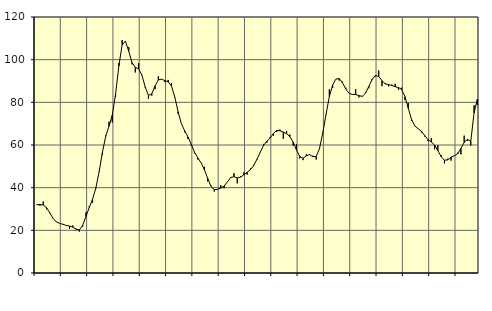
| Category | Piggar | Series 1 |
|---|---|---|
| nan | 31.9 | 32 |
| 87.0 | 31.5 | 32.09 |
| 87.0 | 33.5 | 31.84 |
| 87.0 | 29.9 | 30.66 |
| nan | 28.4 | 28.16 |
| 88.0 | 25.5 | 25.61 |
| 88.0 | 24 | 23.91 |
| 88.0 | 23.2 | 23.28 |
| nan | 23 | 22.83 |
| 89.0 | 22.2 | 22.31 |
| 89.0 | 20.7 | 22 |
| 89.0 | 22.3 | 21.5 |
| nan | 20.8 | 20.48 |
| 90.0 | 19.4 | 20.21 |
| 90.0 | 21.7 | 22.38 |
| 90.0 | 28.4 | 26.5 |
| nan | 31.3 | 30.73 |
| 91.0 | 32.8 | 34.6 |
| 91.0 | 39.6 | 39.81 |
| 91.0 | 47.7 | 47.47 |
| nan | 55.5 | 56.57 |
| 92.0 | 64.4 | 64.08 |
| 92.0 | 70.9 | 68.8 |
| 92.0 | 70.6 | 73.96 |
| nan | 82.6 | 83.82 |
| 93.0 | 98.4 | 97.02 |
| 93.0 | 109.2 | 106.95 |
| 93.0 | 108.5 | 108.73 |
| nan | 105.9 | 103.95 |
| 94.0 | 97.8 | 98.62 |
| 94.0 | 94 | 96.4 |
| 94.0 | 98.4 | 95.74 |
| nan | 92.9 | 92.78 |
| 95.0 | 86.9 | 87.21 |
| 95.0 | 81.6 | 83.26 |
| 95.0 | 83.1 | 83.99 |
| nan | 86.2 | 87.69 |
| 96.0 | 92.2 | 90.52 |
| 96.0 | 90.9 | 90.85 |
| 96.0 | 89.5 | 90.18 |
| nan | 90.5 | 89.58 |
| 97.0 | 89 | 87.57 |
| 97.0 | 82.4 | 82.52 |
| 97.0 | 74.6 | 75.61 |
| nan | 70 | 70.04 |
| 98.0 | 66 | 66.68 |
| 98.0 | 62.8 | 63.81 |
| 98.0 | 59.6 | 60.38 |
| nan | 56.1 | 56.63 |
| 99.0 | 53.2 | 53.98 |
| 99.0 | 51.7 | 51.64 |
| 99.0 | 49.8 | 48.45 |
| nan | 42.9 | 44.41 |
| 0.0 | 41 | 40.71 |
| 0.0 | 38.2 | 39.05 |
| 0.0 | 39.4 | 39.2 |
| nan | 41.1 | 39.79 |
| 1.0 | 39.7 | 40.76 |
| 1.0 | 42.7 | 42.72 |
| 1.0 | 45 | 44.76 |
| nan | 46.8 | 45.15 |
| 2.0 | 42 | 44.59 |
| 2.0 | 45.3 | 44.95 |
| 2.0 | 47.1 | 46.03 |
| nan | 46.1 | 47.2 |
| 3.0 | 49 | 48.44 |
| 3.0 | 50.7 | 50.41 |
| 3.0 | 53.1 | 53.33 |
| nan | 56.6 | 56.67 |
| 4.0 | 60.5 | 59.82 |
| 4.0 | 61.1 | 61.79 |
| 4.0 | 63.8 | 63.26 |
| nan | 64.3 | 65.44 |
| 5.0 | 66.1 | 66.86 |
| 5.0 | 67.2 | 66.67 |
| 5.0 | 62.9 | 66.06 |
| nan | 66.6 | 65.3 |
| 6.0 | 64.9 | 63.93 |
| 6.0 | 59.7 | 61.31 |
| 6.0 | 60.5 | 57.65 |
| nan | 53.7 | 54.65 |
| 7.0 | 52.9 | 53.77 |
| 7.0 | 55.7 | 54.91 |
| 7.0 | 55.3 | 55.53 |
| nan | 55 | 54.56 |
| 8.0 | 53.2 | 54.61 |
| 8.0 | 58.5 | 58.33 |
| 8.0 | 65.9 | 65.66 |
| nan | 74.3 | 74.46 |
| 9.0 | 86.1 | 82.71 |
| 9.0 | 86.8 | 88.13 |
| 9.0 | 90.9 | 90.91 |
| nan | 90.2 | 91.11 |
| 10.0 | 89.7 | 89.18 |
| 10.0 | 86.8 | 86.23 |
| 10.0 | 84.2 | 84.2 |
| nan | 83.6 | 83.7 |
| 11.0 | 86.1 | 83.67 |
| 11.0 | 82.3 | 83.16 |
| 11.0 | 82.6 | 82.81 |
| nan | 84.7 | 84.33 |
| 12.0 | 86.6 | 87.48 |
| 12.0 | 90.4 | 90.74 |
| 12.0 | 92.2 | 92.57 |
| nan | 94.9 | 92.12 |
| 13.0 | 87.6 | 90.18 |
| 13.0 | 89 | 88.63 |
| 13.0 | 87.5 | 88.33 |
| nan | 88.3 | 87.91 |
| 14.0 | 88.7 | 87.3 |
| 14.0 | 85.8 | 86.97 |
| 14.0 | 86.9 | 86.01 |
| nan | 81 | 82.67 |
| 15.0 | 79.7 | 77.19 |
| 15.0 | 71.3 | 71.94 |
| 15.0 | 68.8 | 68.87 |
| nan | 67.6 | 67.67 |
| 16.0 | 65.9 | 66.41 |
| 16.0 | 64 | 64.41 |
| 16.0 | 61.8 | 62.52 |
| nan | 63.2 | 61.38 |
| 17.0 | 58 | 60 |
| 17.0 | 59.9 | 57.37 |
| 17.0 | 55.2 | 54.53 |
| nan | 51.4 | 52.88 |
| 18.0 | 53.6 | 53.03 |
| 18.0 | 52.7 | 54.31 |
| 18.0 | 55 | 54.98 |
| nan | 56.4 | 55.85 |
| 19.0 | 55.6 | 58.41 |
| 19.0 | 64.4 | 61.22 |
| 19.0 | 62 | 62.63 |
| nan | 59.8 | 61.75 |
| 20.0 | 78.6 | 75.03 |
| 20.0 | 78.8 | 81.49 |